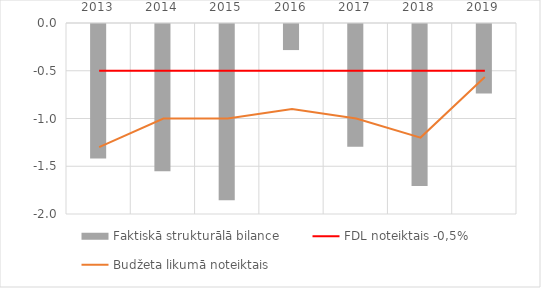
| Category | Faktiskā strukturālā bilance |
|---|---|
| 2013.0 | -1.409 |
| 2014.0 | -1.542 |
| 2015.0 | -1.845 |
| 2016.0 | -0.273 |
| 2017.0 | -1.286 |
| 2018.0 | -1.697 |
| 2019.0 | -0.727 |